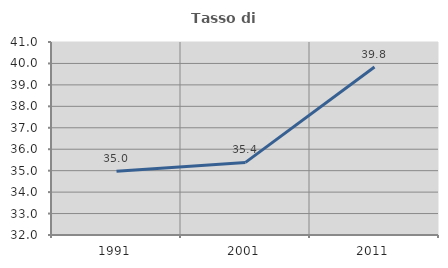
| Category | Tasso di occupazione   |
|---|---|
| 1991.0 | 34.978 |
| 2001.0 | 35.386 |
| 2011.0 | 39.831 |